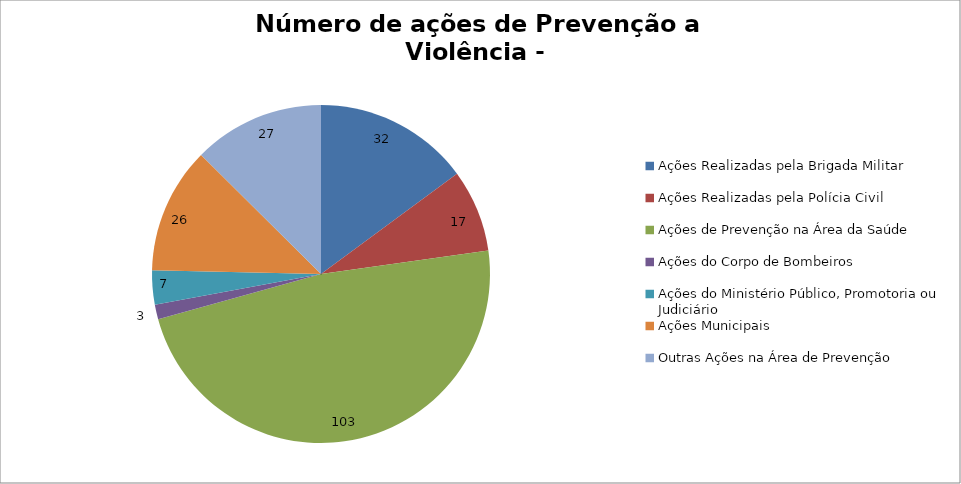
| Category | Número de Ações |
|---|---|
| Ações Realizadas pela Brigada Militar | 32 |
| Ações Realizadas pela Polícia Civil | 17 |
| Ações de Prevenção na Área da Saúde | 103 |
| Ações do Corpo de Bombeiros | 3 |
| Ações do Ministério Público, Promotoria ou Judiciário | 7 |
| Ações Municipais | 26 |
| Outras Ações na Área de Prevenção | 27 |